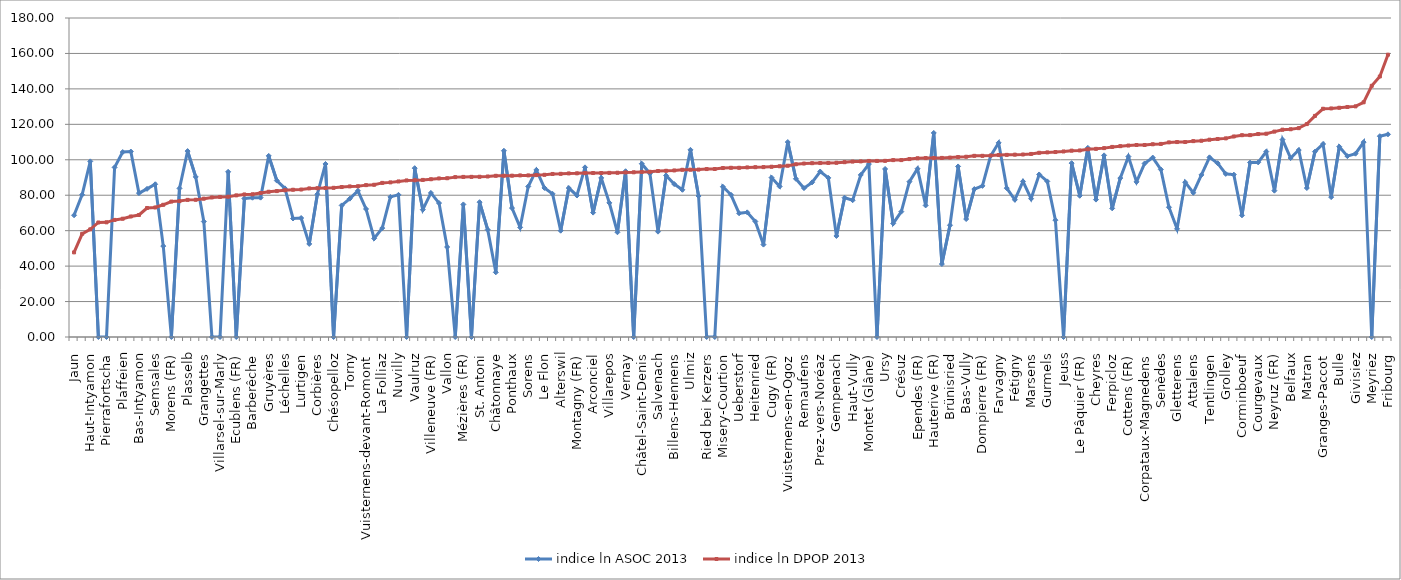
| Category | indice ln ASOC 2013 | indice ln DPOP 2013 |
|---|---|---|
| Jaun | 68.695 | 47.743 |
| Val-de-Charmey | 80.316 | 58.219 |
| Haut-Intyamon | 99.105 | 60.748 |
| Autafond | 0 | 64.623 |
| Pierrafortscha | 0 | 64.713 |
| Grandvillard | 95.721 | 66.064 |
| Plaffeien | 104.368 | 66.745 |
| Prévondavaux | 104.638 | 68.004 |
| Bas-Intyamon | 81.186 | 68.848 |
| Vuissens | 83.596 | 72.79 |
| Semsales | 86.191 | 73.084 |
| Le Châtelard | 51.31 | 74.6 |
| Morens (FR) | 0 | 76.414 |
| Hauteville | 83.867 | 76.693 |
| Plasselb | 104.907 | 77.375 |
| Cheiry | 90.334 | 77.433 |
| Grangettes | 65.172 | 78.056 |
| Russy | 0 | 78.752 |
| Villarsel-sur-Marly | 0 | 79.017 |
| La Roche | 93.204 | 79.181 |
| Ecublens (FR) | 0 | 79.907 |
| Surpierre | 78.157 | 80.439 |
| Barberêche | 78.589 | 80.501 |
| Galmiz | 78.63 | 81.23 |
| Gruyères | 102.195 | 81.964 |
| Murist | 88.27 | 82.333 |
| Léchelles | 83.876 | 82.798 |
| Sâles | 66.862 | 83.092 |
| Lurtigen | 67.132 | 83.203 |
| Ménières | 52.507 | 83.847 |
| Corbières | 80.557 | 83.943 |
| St. Ursen | 97.638 | 84.058 |
| Chésopelloz | 0 | 84.174 |
| Villorsonnens | 74.248 | 84.613 |
| Torny | 78.049 | 84.97 |
| La Verrerie | 82.482 | 85.071 |
| Vuisternens-devant-Romont | 72.24 | 85.692 |
| Noréaz | 55.645 | 85.896 |
| La Folliaz | 61.458 | 86.953 |
| Courlevon | 79.044 | 87.247 |
| Nuvilly | 80.224 | 87.775 |
| Sévaz | 0 | 88.346 |
| Vaulruz | 95.259 | 88.435 |
| Saint-Martin (FR) | 71.87 | 88.64 |
| Villeneuve (FR) | 81.297 | 89.015 |
| Siviriez | 75.587 | 89.479 |
| Vallon | 50.792 | 89.585 |
| Bussy (FR) | 0 | 90.212 |
| Mézières (FR) | 74.812 | 90.339 |
| Corserey | 0 | 90.365 |
| St. Antoni | 76.073 | 90.422 |
| Massonnens | 60.571 | 90.569 |
| Châtonnaye | 36.493 | 90.96 |
| Rueyres-les-Prés | 105.095 | 90.989 |
| Ponthaux | 72.776 | 91.037 |
| Wallenried | 61.856 | 91.178 |
| Sorens | 84.93 | 91.189 |
| Le Glèbe | 94.27 | 91.352 |
| Le Flon | 84.11 | 91.527 |
| Autigny | 80.782 | 91.996 |
| Alterswil | 59.988 | 92.074 |
| Rue | 84.05 | 92.302 |
| Montagny (FR) | 79.856 | 92.352 |
| Treyvaux | 95.728 | 92.523 |
| Arconciel | 70.184 | 92.526 |
| Châtel-sur-Montsalvens | 89.757 | 92.534 |
| Villarepos | 75.685 | 92.612 |
| Botterens | 59.105 | 92.685 |
| Vernay | 93.539 | 92.858 |
| Chapelle (Glâne) | 0 | 92.936 |
| Châtel-Saint-Denis | 97.782 | 93.13 |
| Les Montets | 92.261 | 93.23 |
| Salvenach | 59.441 | 93.65 |
| St. Silvester | 91.101 | 93.793 |
| Billens-Hennens | 86.304 | 93.983 |
| Pont-la-Ville | 83.063 | 94.357 |
| Ulmiz | 105.598 | 94.414 |
| Delley-Portalban | 79.551 | 94.467 |
| Ried bei Kerzers | 0 | 94.763 |
| Auboranges | 0 | 94.791 |
| Misery-Courtion | 84.78 | 95.341 |
| Rechthalten | 80.234 | 95.476 |
| Ueberstorf | 69.807 | 95.478 |
| Fräschels | 70.332 | 95.693 |
| Heitenried | 65.204 | 95.817 |
| Châbles | 52.141 | 95.86 |
| Cugy (FR) | 89.957 | 96.071 |
| La Sonnaz | 84.951 | 96.326 |
| Vuisternens-en-Ogoz | 109.998 | 96.647 |
| Le Mouret | 89.278 | 97.462 |
| Remaufens | 84.007 | 97.88 |
| Echarlens | 87.249 | 98.07 |
| Prez-vers-Noréaz | 93.365 | 98.151 |
| Pont-en-Ogoz | 89.801 | 98.227 |
| Gempenach | 57.001 | 98.311 |
| La Brillaz | 78.594 | 98.647 |
| Haut-Vully | 77.178 | 98.983 |
| Chénens | 91.445 | 99.082 |
| Montet (Glâne) | 97.559 | 99.34 |
| Greng | 0 | 99.348 |
| Ursy | 94.811 | 99.405 |
| Granges (Veveyse) | 64.071 | 99.809 |
| Crésuz | 70.732 | 99.82 |
| Lully (FR) | 87.641 | 100.389 |
| Ependes (FR) | 94.947 | 100.83 |
| Saint-Aubin (FR) | 74.24 | 100.952 |
| Hauterive (FR) | 115.145 | 100.992 |
| Kleinbösingen | 41.17 | 101.049 |
| Brünisried | 63.072 | 101.238 |
| Cressier (FR) | 96.239 | 101.526 |
| Bas-Vully | 66.558 | 101.713 |
| Vuadens | 83.484 | 102.223 |
| Dompierre (FR) | 85.268 | 102.234 |
| Villaz-Saint-Pierre | 102.062 | 102.385 |
| Farvagny | 109.563 | 102.673 |
| Oberschrot | 83.998 | 102.77 |
| Fétigny | 77.435 | 102.902 |
| Zumholz | 87.796 | 102.983 |
| Marsens | 78.049 | 103.292 |
| Bösingen | 91.704 | 103.954 |
| Gurmels | 87.802 | 104.166 |
| Morlon | 65.92 | 104.366 |
| Jeuss | 0 | 104.691 |
| Rossens (FR) | 98.1 | 105.154 |
| Le Pâquier (FR) | 79.699 | 105.257 |
| Broc | 106.723 | 105.915 |
| Cheyres | 77.532 | 106.169 |
| Düdingen | 102.496 | 106.578 |
| Ferpicloz | 72.589 | 107.257 |
| Giffers | 89.675 | 107.693 |
| Cottens (FR) | 101.819 | 108.035 |
| Riaz | 87.534 | 108.336 |
| Corpataux-Magnedens | 97.928 | 108.344 |
| Schmitten (FR) | 101.229 | 108.745 |
| Senèdes | 94.517 | 108.954 |
| Châtillon (FR) | 73.219 | 109.815 |
| Gletterens | 61.021 | 110.003 |
| Avry | 87.333 | 110.017 |
| Attalens | 81.403 | 110.522 |
| Domdidier | 91.456 | 110.746 |
| Tentlingen | 101.379 | 111.338 |
| Bossonnens | 98.07 | 111.725 |
| Grolley | 92.044 | 112.071 |
| Tafers | 91.62 | 113.152 |
| Corminboeuf | 68.67 | 113.862 |
| Kerzers | 98.412 | 113.905 |
| Courgevaux | 98.524 | 114.519 |
| Wünnewil-Flamatt | 104.622 | 114.706 |
| Neyruz (FR) | 82.571 | 115.903 |
| Romont (FR) | 111.381 | 116.979 |
| Belfaux | 100.979 | 117.22 |
| Murten | 105.497 | 117.848 |
| Matran | 84.066 | 120.14 |
| Estavayer-le-Lac | 104.588 | 124.76 |
| Granges-Paccot | 108.907 | 128.792 |
| Muntelier | 78.928 | 128.97 |
| Bulle | 107.37 | 129.352 |
| Courtepin | 102.044 | 129.781 |
| Givisiez | 103.432 | 130.135 |
| Marly | 109.946 | 132.438 |
| Meyriez | 0 | 141.731 |
| Villars-sur-Glâne | 113.32 | 147.015 |
| Fribourg | 114.361 | 159.29 |